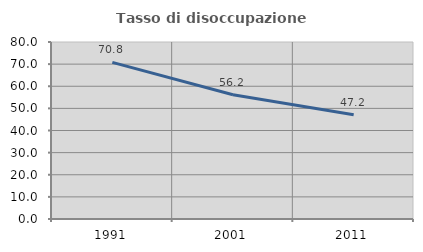
| Category | Tasso di disoccupazione giovanile  |
|---|---|
| 1991.0 | 70.776 |
| 2001.0 | 56.18 |
| 2011.0 | 47.154 |